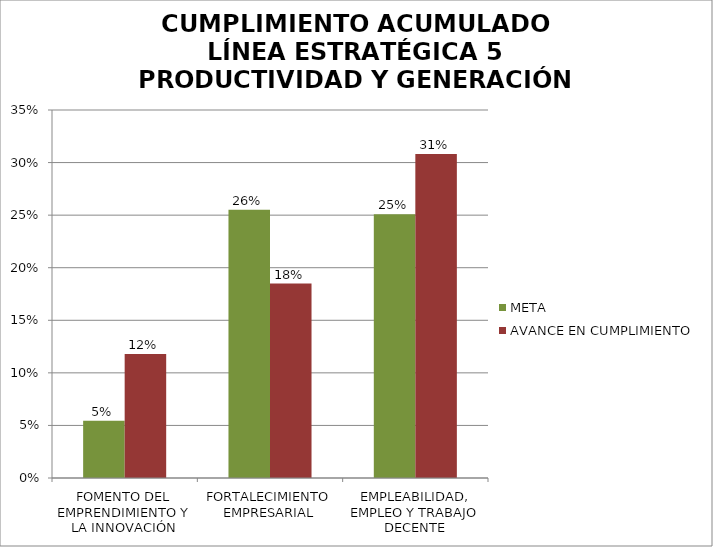
| Category | META | AVANCE EN CUMPLIMIENTO |
|---|---|---|
| FOMENTO DEL EMPRENDIMIENTO Y LA INNOVACIÓN | 0.054 | 0.118 |
| FORTALECIMIENTO EMPRESARIAL | 0.255 | 0.185 |
| EMPLEABILIDAD, EMPLEO Y TRABAJO DECENTE | 0.251 | 0.308 |